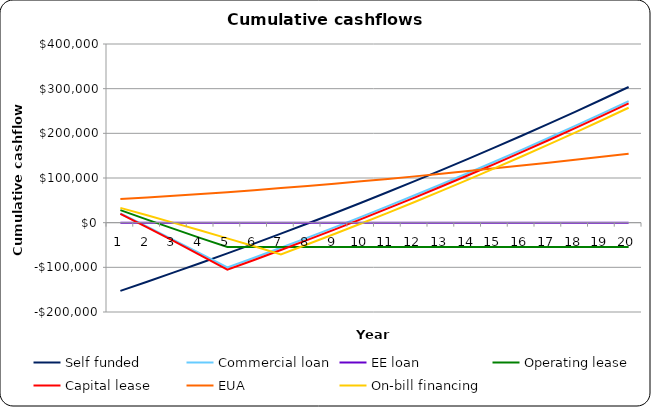
| Category | Self funded | Commercial loan | EE loan | Operating lease | Capital lease | EUA | On-bill financing |
|---|---|---|---|---|---|---|---|
| 0 | -152591.58 | 20550.212 | 0 | 28067.291 | 19765.453 | 52904.276 | 33128.239 |
| 1 | -132162.516 | -8940.281 | 0 | 6855.226 | -10609.574 | 56413.694 | 16437.685 |
| 2 | -111378.223 | -38886.382 | 0 | -14001.609 | -41555.082 | 60154.178 | -474.837 |
| 3 | -90231.596 | -69333.69 | 0 | -34496.111 | -73133.393 | 64123.519 | -17642.627 |
| 4 | -68715.388 | -100331.09 | 0 | -54621.032 | -105411.897 | 68318.954 | -35101.67 |
| 5 | -46822.208 | -78437.91 | 0 | -54621.032 | -83518.717 | 72737.113 | -52890.832 |
| 6 | -24544.517 | -56160.219 | 0 | -54621.032 | -61241.025 | 77373.966 | -71052.072 |
| 7 | -1874.623 | -33490.325 | 0 | -54621.032 | -38571.132 | 82224.767 | -48382.179 |
| 8 | 21195.316 | -10420.386 | 0 | -54621.032 | -15501.193 | 87283.992 | -25312.24 |
| 9 | 44673.302 | 13057.6 | 0 | -54621.032 | 7976.793 | 92545.269 | -1834.254 |
| 10 | 68567.495 | 36951.793 | 0 | -54621.032 | 31870.987 | 98001.311 | 22059.94 |
| 11 | 92886.221 | 61270.519 | 0 | -54621.032 | 56189.712 | 103643.832 | 46378.665 |
| 12 | 117637.969 | 86022.267 | 0 | -54621.032 | 80941.46 | 109463.47 | 71130.413 |
| 13 | 142831.4 | 111215.698 | 0 | -54621.032 | 106134.891 | 115449.692 | 96323.844 |
| 14 | 168475.347 | 136859.645 | 0 | -54621.032 | 131778.839 | 121590.7 | 121967.792 |
| 15 | 194578.822 | 162963.12 | 0 | -54621.032 | 157882.313 | 127873.323 | 148071.266 |
| 16 | 221151.014 | 189535.312 | 0 | -54621.032 | 184454.505 | 134282.91 | 174643.458 |
| 17 | 248201.298 | 216585.596 | 0 | -54621.032 | 211504.789 | 140803.202 | 201693.742 |
| 18 | 275739.235 | 244123.533 | 0 | -54621.032 | 239042.727 | 147416.208 | 229231.68 |
| 19 | 303774.58 | 272158.878 | 0 | -54621.032 | 267078.071 | 154102.061 | 257267.024 |